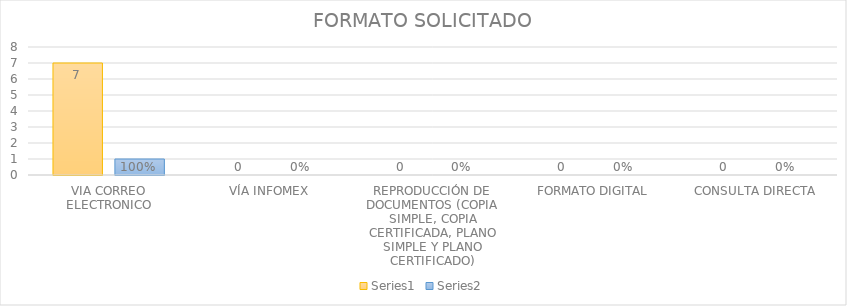
| Category | Series 3 | Series 4 |
|---|---|---|
| VIA CORREO ELECTRONICO | 7 | 1 |
| VÍA INFOMEX | 0 | 0 |
| REPRODUCCIÓN DE DOCUMENTOS (COPIA SIMPLE, COPIA CERTIFICADA, PLANO SIMPLE Y PLANO CERTIFICADO) | 0 | 0 |
| FORMATO DIGITAL | 0 | 0 |
| CONSULTA DIRECTA | 0 | 0 |